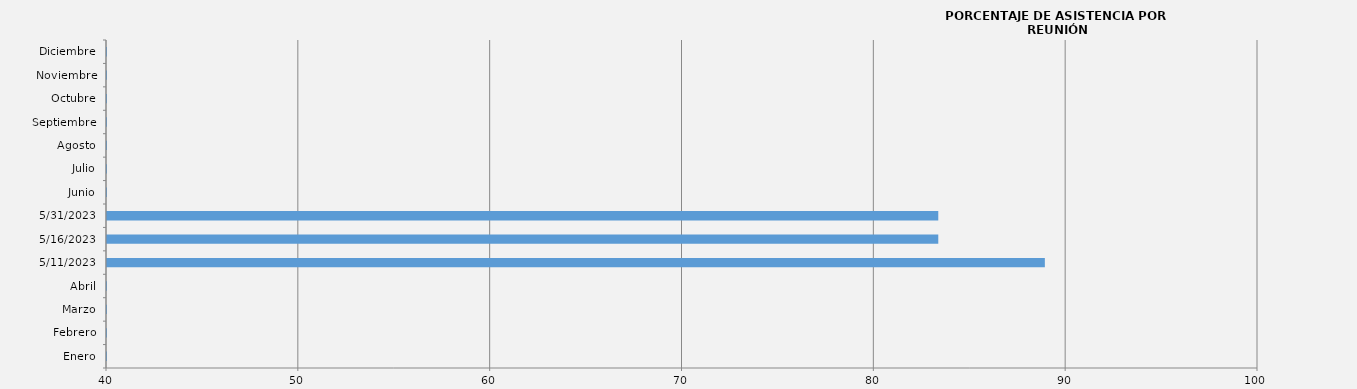
| Category | Series 0 |
|---|---|
| Enero | 0 |
| Febrero | 0 |
| Marzo | 0 |
| Abril | 0 |
| 11/05/2023 | 88.889 |
| 16/05/2023 | 83.333 |
| 31/05/2023 | 83.333 |
| Junio | 0 |
| Julio | 0 |
| Agosto | 0 |
| Septiembre | 0 |
| Octubre | 0 |
| Noviembre | 0 |
| Diciembre | 0 |